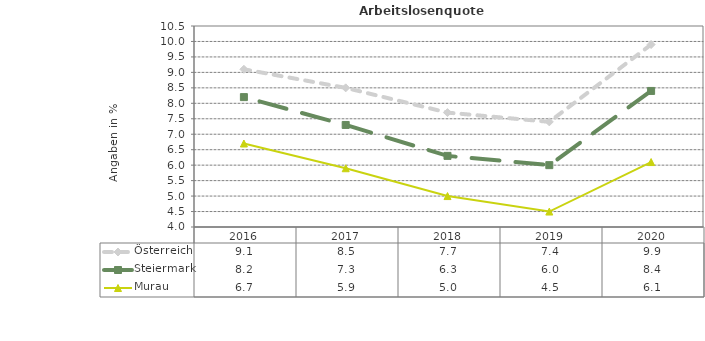
| Category | Österreich | Steiermark | Murau |
|---|---|---|---|
| 2020.0 | 9.9 | 8.4 | 6.1 |
| 2019.0 | 7.4 | 6 | 4.5 |
| 2018.0 | 7.7 | 6.3 | 5 |
| 2017.0 | 8.5 | 7.3 | 5.9 |
| 2016.0 | 9.1 | 8.2 | 6.7 |